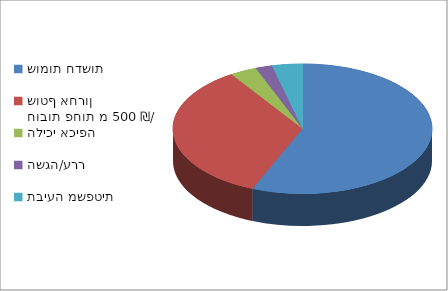
| Category | Series 0 |
|---|---|
| שומות חדשות  | 2206552 |
| חובות פחות מ 500 ₪/ שוטף אחרון  | 1351924.8 |
| הליכי אכיפה  | 131877.7 |
| השגה/ערר | 80940 |
| תביעה משפטית  | 149068 |